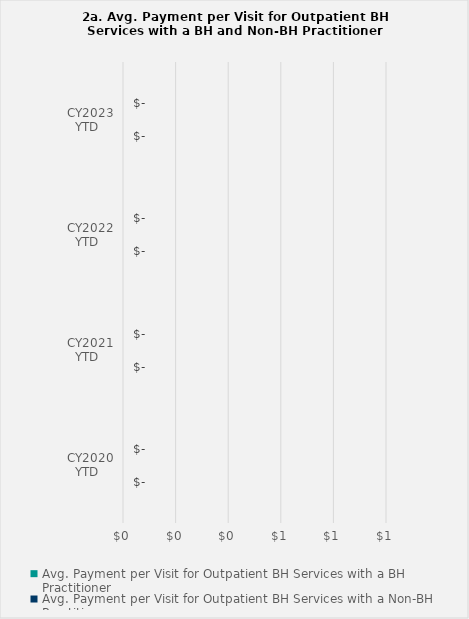
| Category | Avg. Payment per Visit for Outpatient BH Services with a BH Practitioner | Avg. Payment per Visit for Outpatient BH Services with a Non-BH Practitioner |
|---|---|---|
| CY2020 YTD | 0 | 0 |
| CY2021 YTD | 0 | 0 |
| CY2022 YTD | 0 | 0 |
| CY2023 YTD | 0 | 0 |